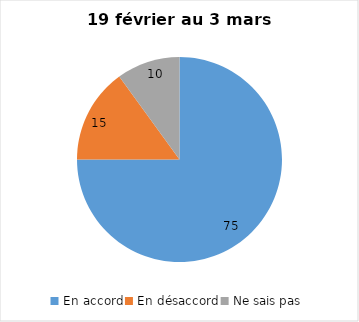
| Category | Series 0 |
|---|---|
| En accord | 75 |
| En désaccord | 15 |
| Ne sais pas | 10 |